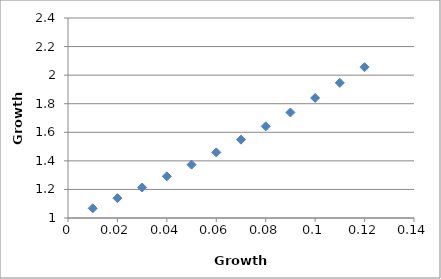
| Category | Rapporto di crescita |
|---|---|
| 0.01 | 1.068 |
| 0.02 | 1.139 |
| 0.03 | 1.213 |
| 0.04 | 1.292 |
| 0.05 | 1.373 |
| 0.06 | 1.459 |
| 0.07 | 1.548 |
| 0.08 | 1.642 |
| 0.09 | 1.739 |
| 0.1 | 1.84 |
| 0.11 | 1.946 |
| 0.12 | 2.056 |